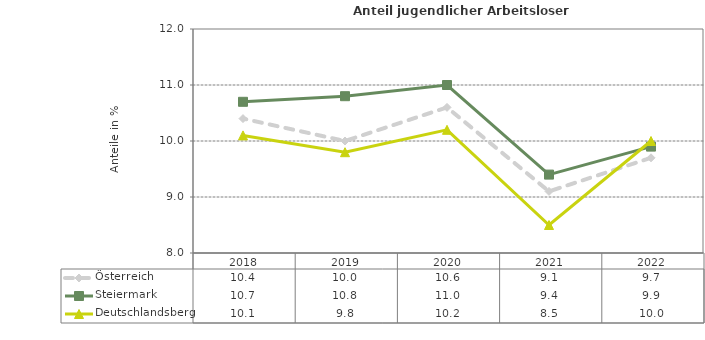
| Category | Österreich | Steiermark | Deutschlandsberg |
|---|---|---|---|
| 2022.0 | 9.7 | 9.9 | 10 |
| 2021.0 | 9.1 | 9.4 | 8.5 |
| 2020.0 | 10.6 | 11 | 10.2 |
| 2019.0 | 10 | 10.8 | 9.8 |
| 2018.0 | 10.4 | 10.7 | 10.1 |